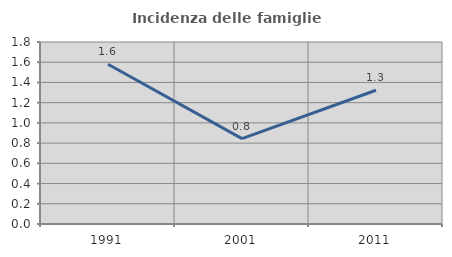
| Category | Incidenza delle famiglie numerose |
|---|---|
| 1991.0 | 1.58 |
| 2001.0 | 0.845 |
| 2011.0 | 1.322 |